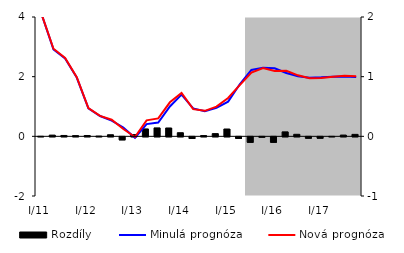
| Category | Rozdíly |
|---|---|
| I/11 | 0.001 |
| II | 0.02 |
| III | 0.015 |
| IV | 0.012 |
| I/12 | 0.014 |
| II | 0.005 |
| III | 0.027 |
| IV | -0.051 |
| I/13 | 0.029 |
| II | 0.124 |
| III | 0.141 |
| IV | 0.14 |
| I/14 | 0.061 |
| II | -0.028 |
| III | 0.013 |
| IV | 0.045 |
| I/15 | 0.123 |
| II | -0.027 |
| III | -0.092 |
| IV | -0.006 |
| I/16 | -0.092 |
| II | 0.075 |
| III | 0.034 |
| IV | -0.024 |
| I/17 | -0.023 |
| II | 0 |
| III | 0.021 |
| IV | 0.033 |